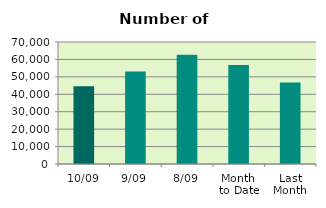
| Category | Series 0 |
|---|---|
| 10/09 | 44668 |
| 9/09 | 53114 |
| 8/09 | 62648 |
| Month 
to Date | 56834.5 |
| Last
Month | 46763.238 |